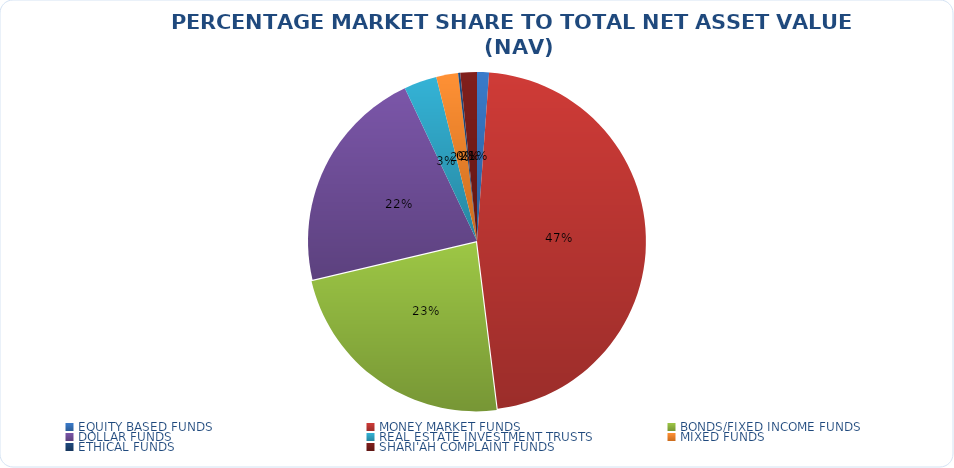
| Category | NET ASSET VALUE |
|---|---|
| EQUITY BASED FUNDS | 16797381909.85 |
| MONEY MARKET FUNDS | 689393093044.699 |
| BONDS/FIXED INCOME FUNDS | 342048621360.029 |
| DOLLAR FUNDS | 318454224920.628 |
| REAL ESTATE INVESTMENT TRUSTS | 46212263995.17 |
| MIXED FUNDS | 30652475117.892 |
| ETHICAL FUNDS | 3046932460.89 |
| SHARI'AH COMPLAINT FUNDS | 23218611718.28 |